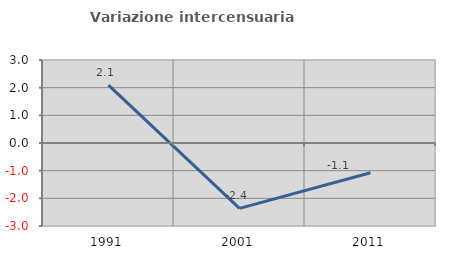
| Category | Variazione intercensuaria annua |
|---|---|
| 1991.0 | 2.092 |
| 2001.0 | -2.364 |
| 2011.0 | -1.074 |